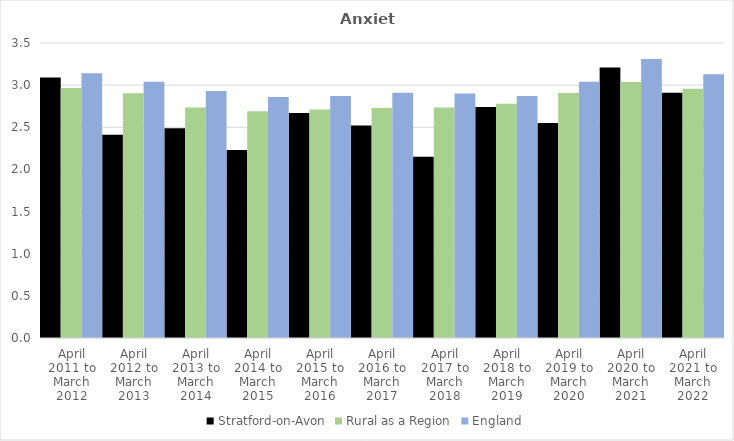
| Category | Stratford-on-Avon | Rural as a Region | England |
|---|---|---|---|
| April 2011 to March 2012 | 3.09 | 2.967 | 3.14 |
| April 2012 to March 2013 | 2.41 | 2.904 | 3.04 |
| April 2013 to March 2014 | 2.49 | 2.734 | 2.93 |
| April 2014 to March 2015 | 2.23 | 2.691 | 2.86 |
| April 2015 to March 2016 | 2.67 | 2.711 | 2.87 |
| April 2016 to March 2017 | 2.52 | 2.729 | 2.91 |
| April 2017 to March 2018 | 2.15 | 2.736 | 2.9 |
| April 2018 to March 2019 | 2.74 | 2.78 | 2.87 |
| April 2019 to March 2020 | 2.55 | 2.908 | 3.04 |
| April 2020 to March 2021 | 3.21 | 3.036 | 3.31 |
| April 2021 to March 2022 | 2.91 | 2.956 | 3.13 |